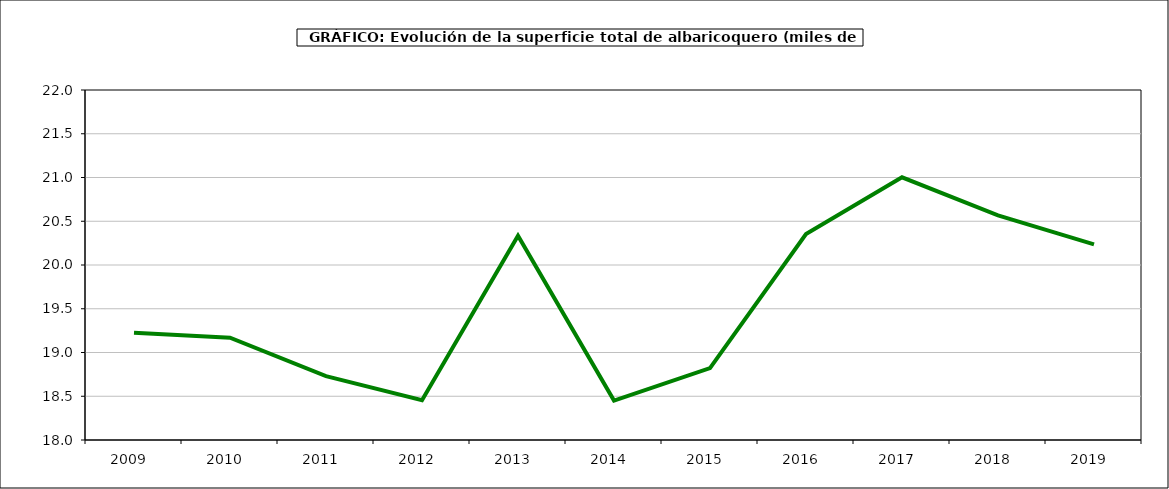
| Category | superficie albaricoquero |
|---|---|
| 2009.0 | 19.226 |
| 2010.0 | 19.169 |
| 2011.0 | 18.729 |
| 2012.0 | 18.455 |
| 2013.0 | 20.334 |
| 2014.0 | 18.451 |
| 2015.0 | 18.822 |
| 2016.0 | 20.353 |
| 2017.0 | 21.002 |
| 2018.0 | 20.567 |
| 2019.0 | 20.235 |